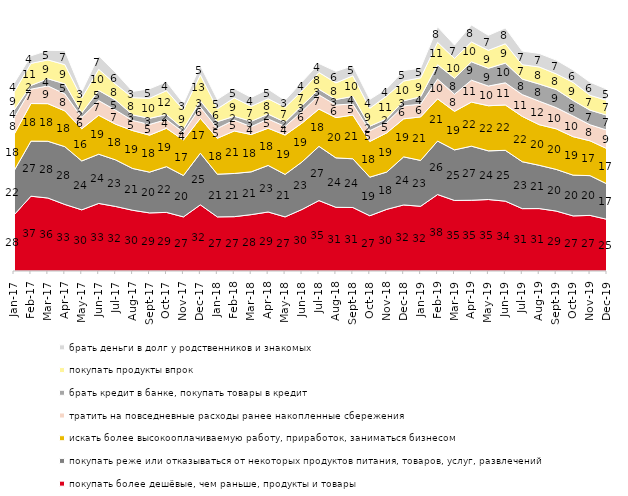
| Category | покупать более дешёвые, чем раньше, продукты и товары | покупать реже или отказываться от некоторых продуктов питания, товаров, услуг, развлечений | искать более высокооплачиваемую работу, приработок, заниматься бизнесом | тратить на повседневные расходы ранее накопленные сбережения | брать кредит в банке, покупать товары в кредит | покупать продукты впрок | брать деньги в долг у родственников и знакомых |
|---|---|---|---|---|---|---|---|
| 2017-01-01 | 27.5 | 21.65 | 17.8 | 8.15 | 3.75 | 8.85 | 4.3 |
| 2017-02-01 | 36.7 | 27 | 18.45 | 7.05 | 1.85 | 10.8 | 3.7 |
| 2017-03-01 | 35.8 | 27.85 | 18.45 | 8.7 | 3.5 | 9.25 | 4.7 |
| 2017-04-01 | 32.65 | 28.35 | 17.55 | 8.35 | 4.95 | 9.4 | 6.85 |
| 2017-05-01 | 30 | 24 | 15.75 | 5.6 | 2.2 | 7.3 | 3.15 |
| 2017-06-01 | 33.15 | 24.15 | 19.1 | 7.2 | 5 | 10.35 | 6.6 |
| 2017-07-01 | 31.65 | 22.85 | 17.5 | 6.9 | 4.95 | 7.75 | 5.7 |
| 2017-08-01 | 29.8 | 20.5 | 18.6 | 4.95 | 2.75 | 8.45 | 3.05 |
| 2017-09-01 | 28.5 | 20 | 18.15 | 5.25 | 3 | 9.85 | 4.65 |
| 2017-10-01 | 28.75 | 22.45 | 18.8 | 4.3 | 2.45 | 11.7 | 4.35 |
| 2017-11-01 | 26.55 | 20.3 | 17.4 | 3.8 | 1.7 | 9.3 | 3.1 |
| 2017-12-01 | 32.45 | 25.35 | 17.1 | 5.55 | 3.05 | 12.7 | 4.5 |
| 2018-01-01 | 26.55 | 20.95 | 17.6 | 4.85 | 3.3 | 6.35 | 4.55 |
| 2018-02-01 | 26.65 | 21.2 | 20.85 | 5.35 | 1.85 | 9 | 4.6 |
| 2018-03-01 | 27.65 | 21 | 18.3 | 3.85 | 2.65 | 7.35 | 4.35 |
| 2018-04-01 | 28.95 | 22.85 | 18.25 | 4.55 | 2.35 | 7.55 | 4.7 |
| 2018-05-01 | 26.55 | 20.85 | 19.3 | 4.2 | 2.15 | 7.25 | 3.45 |
| 2018-06-01 | 30.2 | 23.3 | 19.05 | 5.8 | 2.8 | 7.2 | 4.45 |
| 2018-07-01 | 34.55 | 26.6 | 18.3 | 6.95 | 2.75 | 8.25 | 4.4 |
| 2018-08-01 | 31.25 | 24.25 | 19.75 | 6.2 | 2.7 | 8.15 | 5.65 |
| 2018-09-01 | 31.15 | 23.9 | 21.45 | 5.45 | 3.7 | 10.1 | 4.95 |
| 2018-10-01 | 27.1 | 18.95 | 17.5 | 5.3 | 2.2 | 8.8 | 4.35 |
| 2018-11-01 | 30.24 | 18.313 | 19.212 | 5.14 | 1.796 | 11.178 | 3.543 |
| 2018-12-01 | 32.4 | 23.6 | 18.65 | 6.35 | 2.5 | 9.7 | 5.15 |
| 2019-01-01 | 31.75 | 22.5 | 21.35 | 6.25 | 3.65 | 9.25 | 4.8 |
| 2019-02-01 | 37.5 | 26.25 | 20.7 | 9.7 | 7.05 | 10.95 | 7.65 |
| 2019-03-01 | 34.61 | 24.814 | 18.896 | 8.404 | 7.857 | 9.697 | 6.564 |
| 2019-04-01 | 34.703 | 26.535 | 21.634 | 10.743 | 9.01 | 9.752 | 8.317 |
| 2019-05-01 | 35.067 | 23.873 | 22.14 | 9.658 | 8.717 | 8.816 | 7.33 |
| 2019-06-01 | 34.264 | 24.938 | 22.244 | 10.873 | 9.676 | 9.476 | 7.781 |
| 2019-07-01 | 30.594 | 23.02 | 22.228 | 10.693 | 7.624 | 7.03 | 6.683 |
| 2019-08-01 | 30.619 | 21.229 | 19.93 | 11.538 | 8.392 | 8.392 | 6.643 |
| 2019-09-01 | 29.406 | 20.446 | 19.901 | 10.396 | 8.911 | 7.673 | 6.733 |
| 2019-10-01 | 27.03 | 20 | 18.861 | 10.149 | 7.624 | 8.861 | 6.089 |
| 2019-11-01 | 27.277 | 19.505 | 17.079 | 7.871 | 7.178 | 7.277 | 6.436 |
| 2019-12-01 | 25.347 | 17.376 | 17.277 | 9.109 | 7.327 | 7.277 | 5.446 |